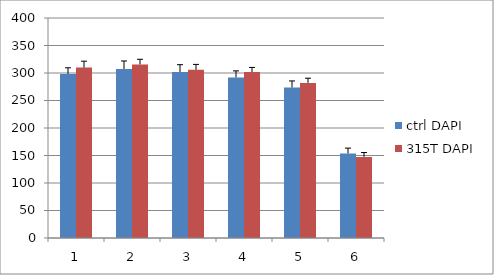
| Category | ctrl DAPI | 315T DAPI |
|---|---|---|
| 0 | 298.333 | 309.815 |
| 1 | 307.286 | 315.63 |
| 2 | 301.857 | 305.815 |
| 3 | 291.905 | 301.667 |
| 4 | 273.714 | 282 |
| 5 | 153.714 | 147.481 |